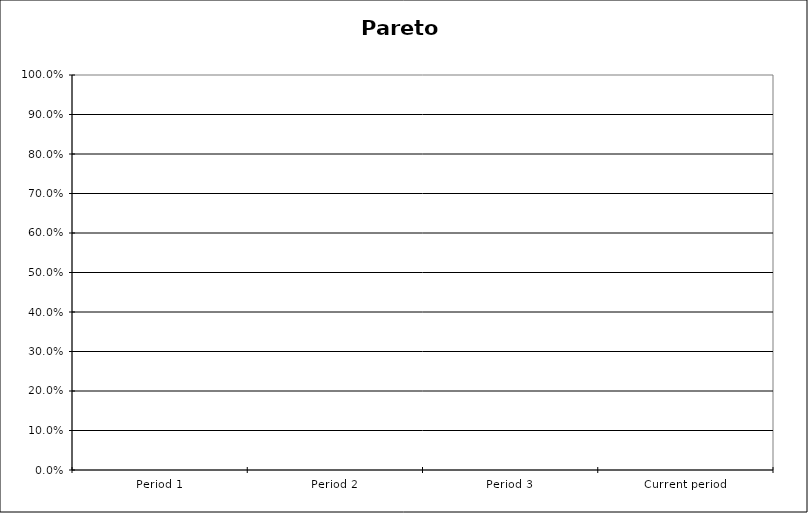
| Category | Problem 1 |
|---|---|
| Period 1 | 0 |
| Period 2 | 0 |
| Period 3 | 0 |
| Current period | 0 |